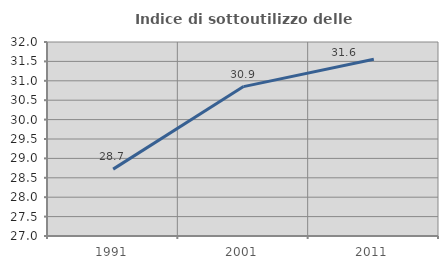
| Category | Indice di sottoutilizzo delle abitazioni  |
|---|---|
| 1991.0 | 28.723 |
| 2001.0 | 30.851 |
| 2011.0 | 31.557 |